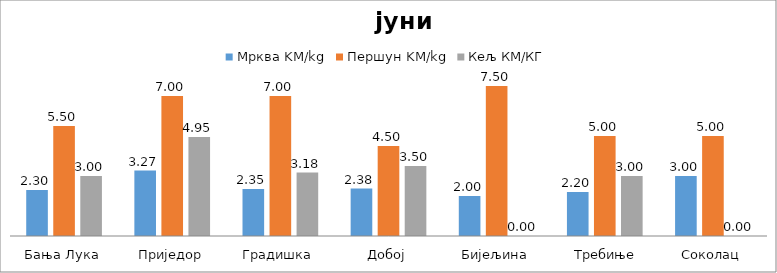
| Category | Мрква | Першун | Кељ |
|---|---|---|---|
| Бања Лука | 2.3 | 5.5 | 3 |
| Приједор | 3.27 | 7 | 4.945 |
| Градишка | 2.35 | 7 | 3.175 |
| Добој | 2.375 | 4.5 | 3.5 |
| Бијељина | 2 | 7.5 | 0 |
|  Требиње | 2.2 | 5 | 3 |
| Соколац | 3 | 5 | 0 |